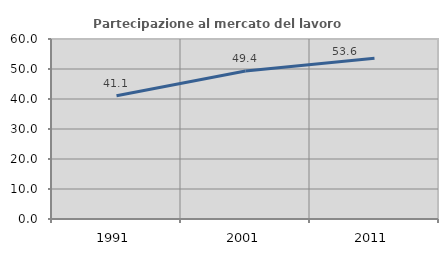
| Category | Partecipazione al mercato del lavoro  femminile |
|---|---|
| 1991.0 | 41.057 |
| 2001.0 | 49.364 |
| 2011.0 | 53.595 |